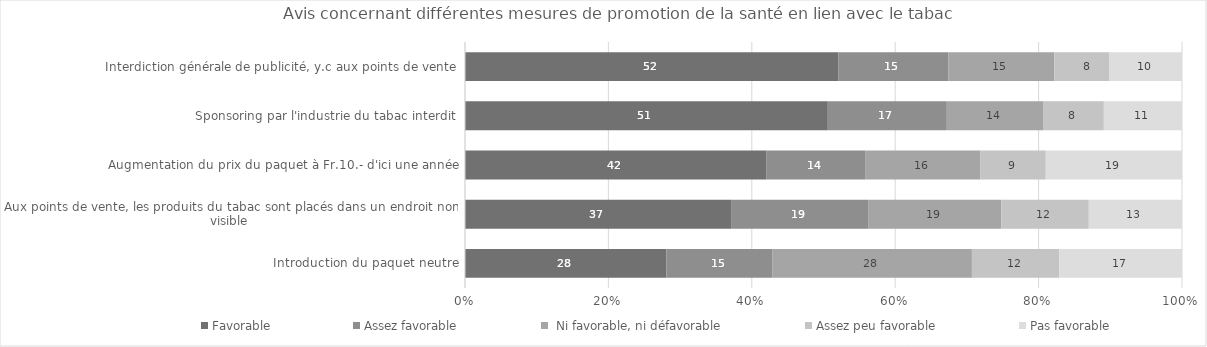
| Category | Favorable | Assez favorable |  Ni favorable, ni défavorable | Assez peu favorable | Pas favorable |
|---|---|---|---|---|---|
| Interdiction générale de publicité, y.c aux points de vente | 52.1 | 15.3 | 14.8 | 7.7 | 10.1 |
| Sponsoring par l'industrie du tabac interdit | 50.6 | 16.6 | 13.5 | 8.4 | 10.9 |
| Augmentation du prix du paquet à Fr.10.- d'ici une année | 42 | 13.8 | 16.1 | 9.1 | 19 |
| Aux points de vente, les produits du tabac sont placés dans un endroit non visible | 37.2 | 19.1 | 18.5 | 12.2 | 13 |
| Introduction du paquet neutre | 28.1 | 14.8 | 27.8 | 12.2 | 17.1 |